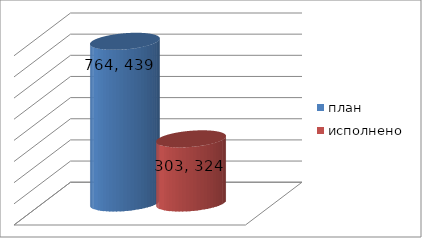
| Category | план | исполнено |
|---|---|---|
| 0 | 764439744.27 | 303324035.45 |